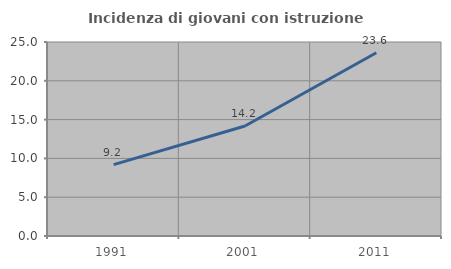
| Category | Incidenza di giovani con istruzione universitaria |
|---|---|
| 1991.0 | 9.195 |
| 2001.0 | 14.173 |
| 2011.0 | 23.622 |